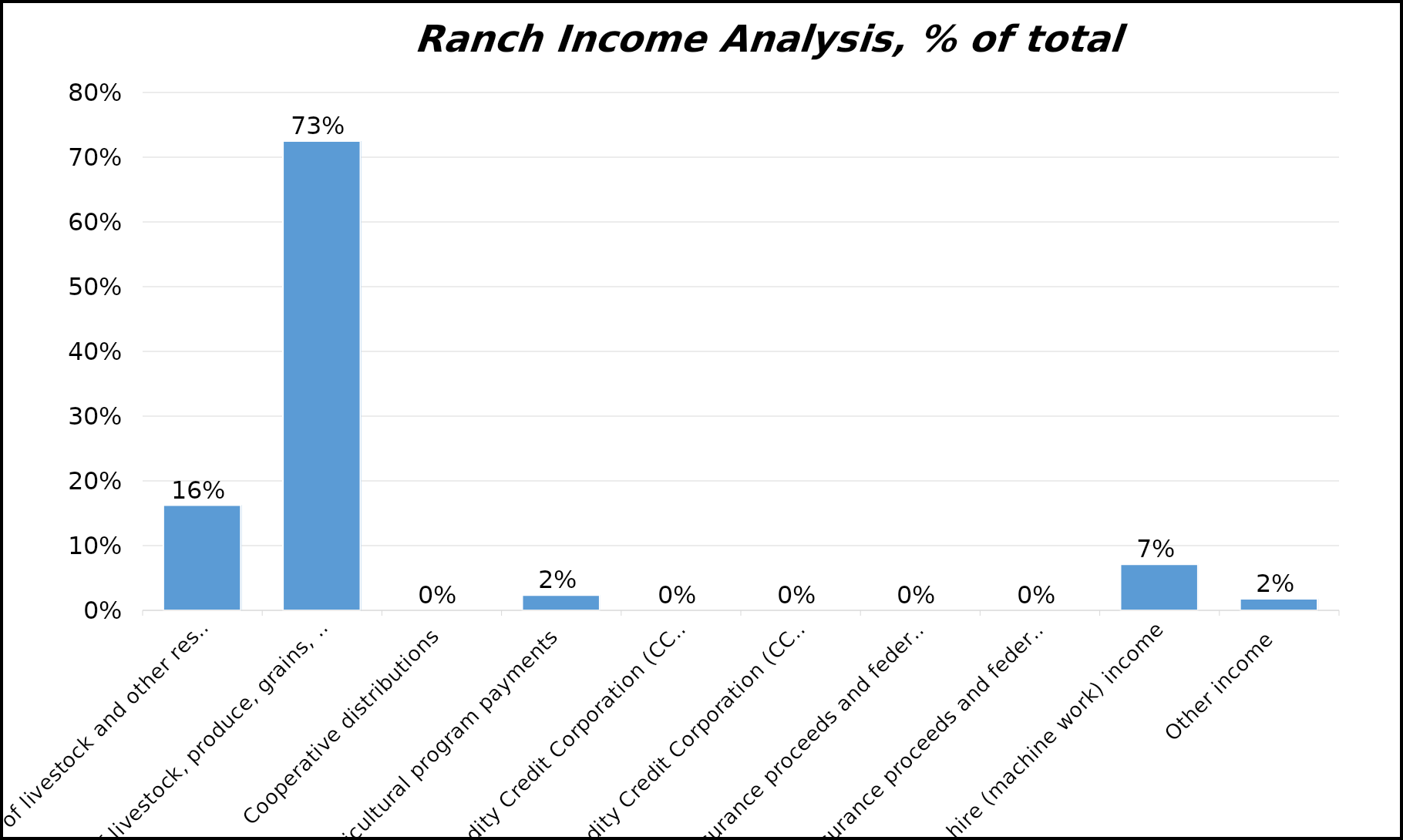
| Category | % of total revenue |
|---|---|
| Net sales of livestock and other resale items | 0.162 |
| Sales of livestock, produce, grains, and other products you raised | 0.725 |
| Cooperative distributions | 0 |
| Agricultural program payments | 0.024 |
| Commodity Credit Corporation (CCC) loans reported under election | 0 |
| Commodity Credit Corporation (CCC) loans forfeited | 0 |
| Crop insurance proceeds and federal crop disaster payments | 0 |
| Crop insurance proceeds and federal crop disaster payments deferred | 0 |
| Custom hire (machine work) income | 0.071 |
| Other income | 0.018 |